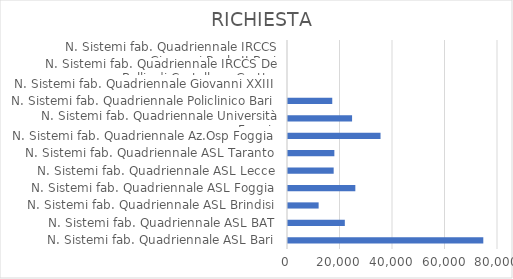
| Category | RICHIESTA |
|---|---|
| N. Sistemi fab. Quadriennale ASL Bari | 74400 |
| N. Sistemi fab. Quadriennale ASL BAT | 21650 |
| N. Sistemi fab. Quadriennale ASL Brindisi | 11670 |
| N. Sistemi fab. Quadriennale ASL Foggia | 25650 |
| N. Sistemi fab. Quadriennale ASL Lecce | 17400 |
| N. Sistemi fab. Quadriennale ASL Taranto | 17660 |
| N. Sistemi fab. Quadriennale Az.Osp Foggia | 35250 |
| N. Sistemi fab. Quadriennale Università Foggia | 24410 |
| N. Sistemi fab. Quadriennale Policlinico Bari | 16860 |
| N. Sistemi fab. Quadriennale Giovanni XXIII | 0 |
| N. Sistemi fab. Quadriennale IRCCS De Bellis di Castellana Grotte | 0 |
| N. Sistemi fab. Quadriennale IRCCS Giovanni Paolo II Bari | 0 |